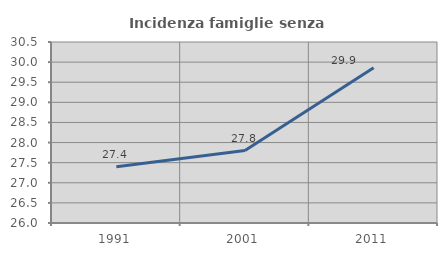
| Category | Incidenza famiglie senza nuclei |
|---|---|
| 1991.0 | 27.397 |
| 2001.0 | 27.8 |
| 2011.0 | 29.858 |